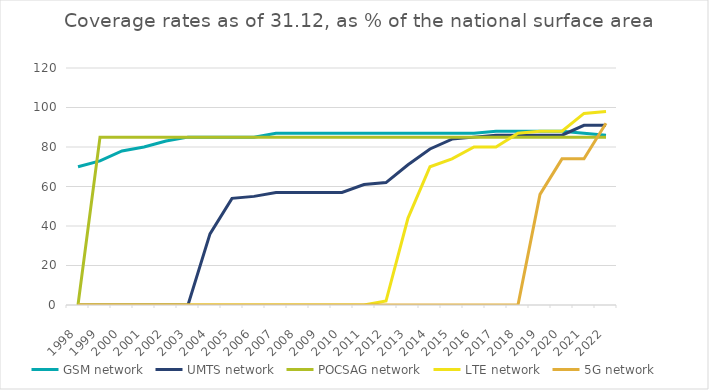
| Category | GSM network | UMTS network | POCSAG network | LTE network | 5G network |
|---|---|---|---|---|---|
| 1998.0 | 70 | 0 | 0 | 0 | 0 |
| 1999.0 | 73 | 0 | 85 | 0 | 0 |
| 2000.0 | 78 | 0 | 85 | 0 | 0 |
| 2001.0 | 80 | 0 | 85 | 0 | 0 |
| 2002.0 | 83 | 0 | 85 | 0 | 0 |
| 2003.0 | 85 | 0 | 85 | 0 | 0 |
| 2004.0 | 85 | 36 | 85 | 0 | 0 |
| 2005.0 | 85 | 54 | 85 | 0 | 0 |
| 2006.0 | 85 | 55 | 85 | 0 | 0 |
| 2007.0 | 87 | 57 | 85 | 0 | 0 |
| 2008.0 | 87 | 57 | 85 | 0 | 0 |
| 2009.0 | 87 | 57 | 85 | 0 | 0 |
| 2010.0 | 87 | 57 | 85 | 0 | 0 |
| 2011.0 | 87 | 61 | 85 | 0 | 0 |
| 2012.0 | 87 | 62 | 85 | 2 | 0 |
| 2013.0 | 87 | 71 | 85 | 44 | 0 |
| 2014.0 | 87 | 79 | 85 | 70 | 0 |
| 2015.0 | 87 | 84 | 85 | 74 | 0 |
| 2016.0 | 87 | 85 | 85 | 80 | 0 |
| 2017.0 | 88 | 86 | 85 | 80 | 0 |
| 2018.0 | 88 | 86 | 85 | 87 | 0 |
| 2019.0 | 88 | 86 | 85 | 88 | 56 |
| 2020.0 | 88 | 86 | 85 | 88 | 74 |
| 2021.0 | 87 | 91 | 85 | 97 | 74 |
| 2022.0 | 86 | 91 | 85 | 98 | 92 |